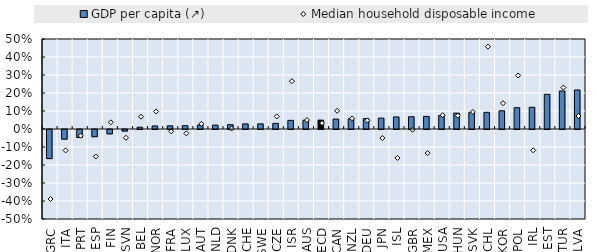
| Category | GDP per capita (↗) |
|---|---|
| GRC | -0.162 |
| ITA | -0.054 |
| PRT | -0.045 |
| ESP | -0.04 |
| FIN | -0.024 |
| SVN | -0.009 |
| BEL | 0.01 |
| NOR | 0.017 |
| FRA | 0.018 |
| LUX | 0.018 |
| AUT | 0.021 |
| NLD | 0.022 |
| DNK | 0.024 |
| CHE | 0.028 |
| SWE | 0.029 |
| CZE | 0.031 |
| ISR | 0.048 |
| AUS | 0.049 |
| OECD | 0.049 |
| CAN | 0.055 |
| NZL | 0.057 |
| DEU | 0.058 |
| JPN | 0.06 |
| ISL | 0.067 |
| GBR | 0.068 |
| MEX | 0.07 |
| USA | 0.075 |
| HUN | 0.088 |
| SVK | 0.092 |
| CHL | 0.093 |
| KOR | 0.101 |
| POL | 0.118 |
| IRL | 0.121 |
| EST | 0.193 |
| TUR | 0.211 |
| LVA | 0.217 |